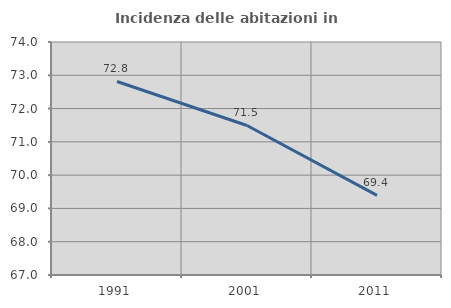
| Category | Incidenza delle abitazioni in proprietà  |
|---|---|
| 1991.0 | 72.814 |
| 2001.0 | 71.492 |
| 2011.0 | 69.39 |